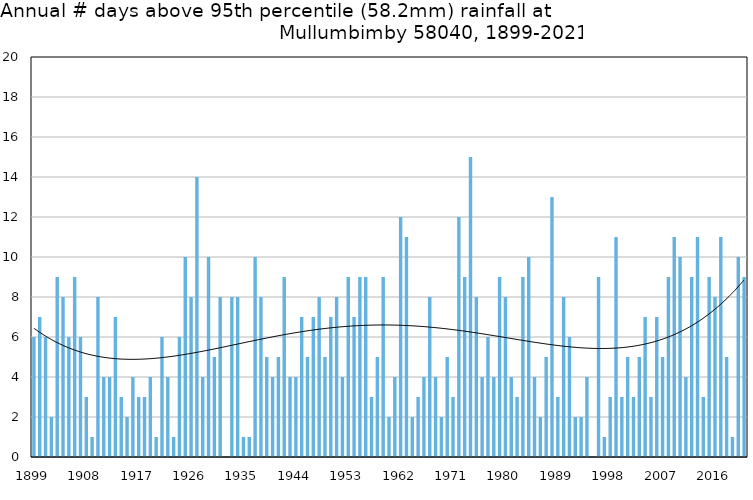
| Category | Annual # days above 95th percentile |
|---|---|
| 1899 | 6 |
| 1900 | 7 |
| 1901 | 6 |
| 1902 | 2 |
| 1903 | 9 |
| 1904 | 8 |
| 1905 | 6 |
| 1906 | 9 |
| 1907 | 6 |
| 1908 | 3 |
| 1909 | 1 |
| 1910 | 8 |
| 1911 | 4 |
| 1912 | 4 |
| 1913 | 7 |
| 1914 | 3 |
| 1915 | 2 |
| 1916 | 4 |
| 1917 | 3 |
| 1918 | 3 |
| 1919 | 4 |
| 1920 | 1 |
| 1921 | 6 |
| 1922 | 4 |
| 1923 | 1 |
| 1924 | 6 |
| 1925 | 10 |
| 1926 | 8 |
| 1927 | 14 |
| 1928 | 4 |
| 1929 | 10 |
| 1930 | 5 |
| 1931 | 8 |
| 1932 | 0 |
| 1933 | 8 |
| 1934 | 8 |
| 1935 | 1 |
| 1936 | 1 |
| 1937 | 10 |
| 1938 | 8 |
| 1939 | 5 |
| 1940 | 4 |
| 1941 | 5 |
| 1942 | 9 |
| 1943 | 4 |
| 1944 | 4 |
| 1945 | 7 |
| 1946 | 5 |
| 1947 | 7 |
| 1948 | 8 |
| 1949 | 5 |
| 1950 | 7 |
| 1951 | 8 |
| 1952 | 4 |
| 1953 | 9 |
| 1954 | 7 |
| 1955 | 9 |
| 1956 | 9 |
| 1957 | 3 |
| 1958 | 5 |
| 1959 | 9 |
| 1960 | 2 |
| 1961 | 4 |
| 1962 | 12 |
| 1963 | 11 |
| 1964 | 2 |
| 1965 | 3 |
| 1966 | 4 |
| 1967 | 8 |
| 1968 | 4 |
| 1969 | 2 |
| 1970 | 5 |
| 1971 | 3 |
| 1972 | 12 |
| 1973 | 9 |
| 1974 | 15 |
| 1975 | 8 |
| 1976 | 4 |
| 1977 | 6 |
| 1978 | 4 |
| 1979 | 9 |
| 1980 | 8 |
| 1981 | 4 |
| 1982 | 3 |
| 1983 | 9 |
| 1984 | 10 |
| 1985 | 4 |
| 1986 | 2 |
| 1987 | 5 |
| 1988 | 13 |
| 1989 | 3 |
| 1990 | 8 |
| 1991 | 6 |
| 1992 | 2 |
| 1993 | 2 |
| 1994 | 4 |
| 1995 | 0 |
| 1996 | 9 |
| 1997 | 1 |
| 1998 | 3 |
| 1999 | 11 |
| 2000 | 3 |
| 2001 | 5 |
| 2002 | 3 |
| 2003 | 5 |
| 2004 | 7 |
| 2005 | 3 |
| 2006 | 7 |
| 2007 | 5 |
| 2008 | 9 |
| 2009 | 11 |
| 2010 | 10 |
| 2011 | 4 |
| 2012 | 9 |
| 2013 | 11 |
| 2014 | 3 |
| 2015 | 9 |
| 2016 | 8 |
| 2017 | 11 |
| 2018 | 5 |
| 2019 | 1 |
| 2020 | 10 |
| 2021 | 9 |